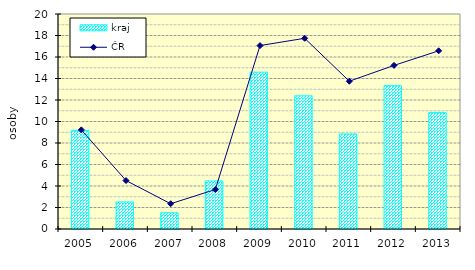
| Category | kraj |
|---|---|
| 2005.0 | 9.176 |
| 2006.0 | 2.519 |
| 2007.0 | 1.513 |
| 2008.0 | 4.47 |
| 2009.0 | 14.587 |
| 2010.0 | 12.386 |
| 2011.0 | 8.843 |
| 2012.0 | 13.337 |
| 2013.0 | 10.846 |